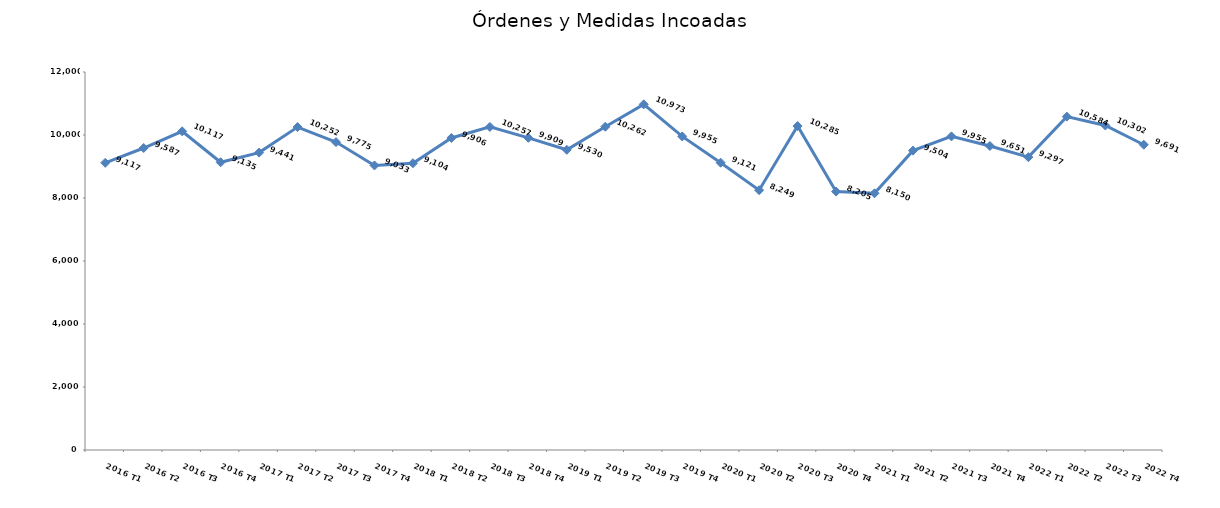
| Category | Órdenes y Medidas incoadas |
|---|---|
| 2016 T1 | 9117 |
| 2016 T2 | 9587 |
| 2016 T3 | 10117 |
| 2016 T4 | 9135 |
| 2017 T1 | 9441 |
| 2017 T2 | 10252 |
| 2017 T3 | 9775 |
| 2017 T4 | 9033 |
| 2018 T1 | 9104 |
| 2018 T2 | 9906 |
| 2018 T3 | 10257 |
| 2018 T4 | 9909 |
| 2019 T1 | 9530 |
| 2019 T2 | 10262 |
| 2019 T3 | 10973 |
| 2019 T4 | 9955 |
| 2020 T1 | 9121 |
| 2020 T2 | 8249 |
| 2020 T3 | 10285 |
| 2020 T4 | 8205 |
| 2021 T1 | 8150 |
| 2021 T2 | 9504 |
| 2021 T3 | 9955 |
| 2021 T4 | 9651 |
| 2022 T1 | 9297 |
| 2022 T2 | 10584 |
| 2022 T3 | 10302 |
| 2022 T4 | 9691 |